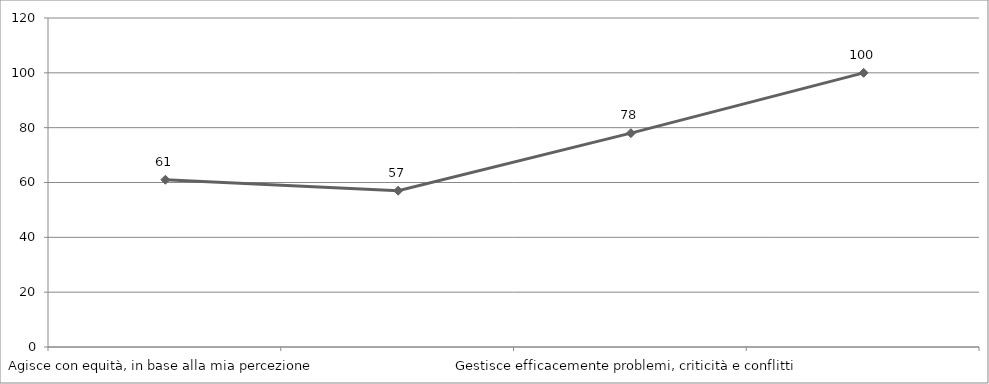
| Category | Series 0 |
|---|---|
| Agisce con equità, in base alla mia percezione | 61 |
| Agisce con equità, secondo la percezione dei miei colleghi di lavoro | 57 |
| Gestisce efficacemente problemi, criticità e conflitti | 78 |
| Stimo il mio capo e lo considero una persona competente e di valore | 100 |